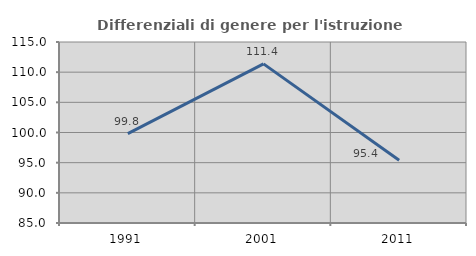
| Category | Differenziali di genere per l'istruzione superiore |
|---|---|
| 1991.0 | 99.825 |
| 2001.0 | 111.377 |
| 2011.0 | 95.412 |